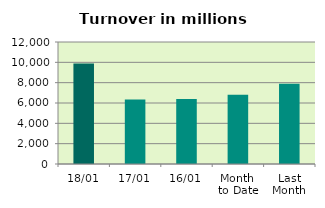
| Category | Series 0 |
|---|---|
| 18/01 | 9896.536 |
| 17/01 | 6338.57 |
| 16/01 | 6399.179 |
| Month 
to Date | 6800.069 |
| Last
Month | 7903.143 |